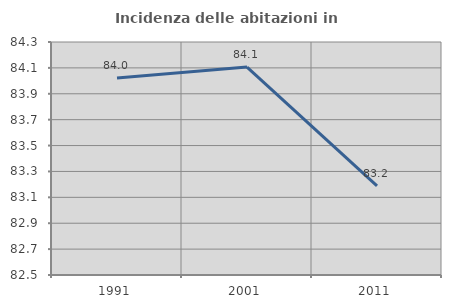
| Category | Incidenza delle abitazioni in proprietà  |
|---|---|
| 1991.0 | 84.022 |
| 2001.0 | 84.106 |
| 2011.0 | 83.188 |